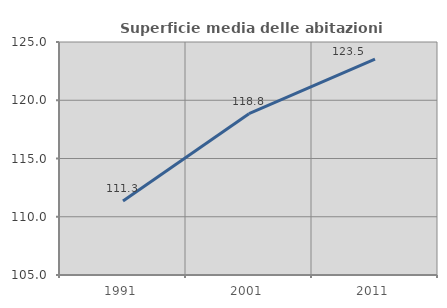
| Category | Superficie media delle abitazioni occupate |
|---|---|
| 1991.0 | 111.346 |
| 2001.0 | 118.848 |
| 2011.0 | 123.533 |